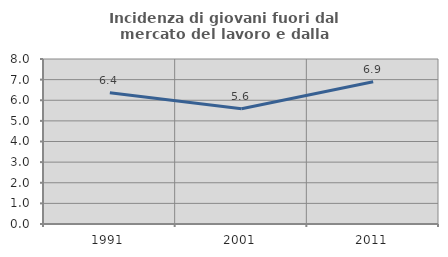
| Category | Incidenza di giovani fuori dal mercato del lavoro e dalla formazione  |
|---|---|
| 1991.0 | 6.366 |
| 2001.0 | 5.584 |
| 2011.0 | 6.897 |